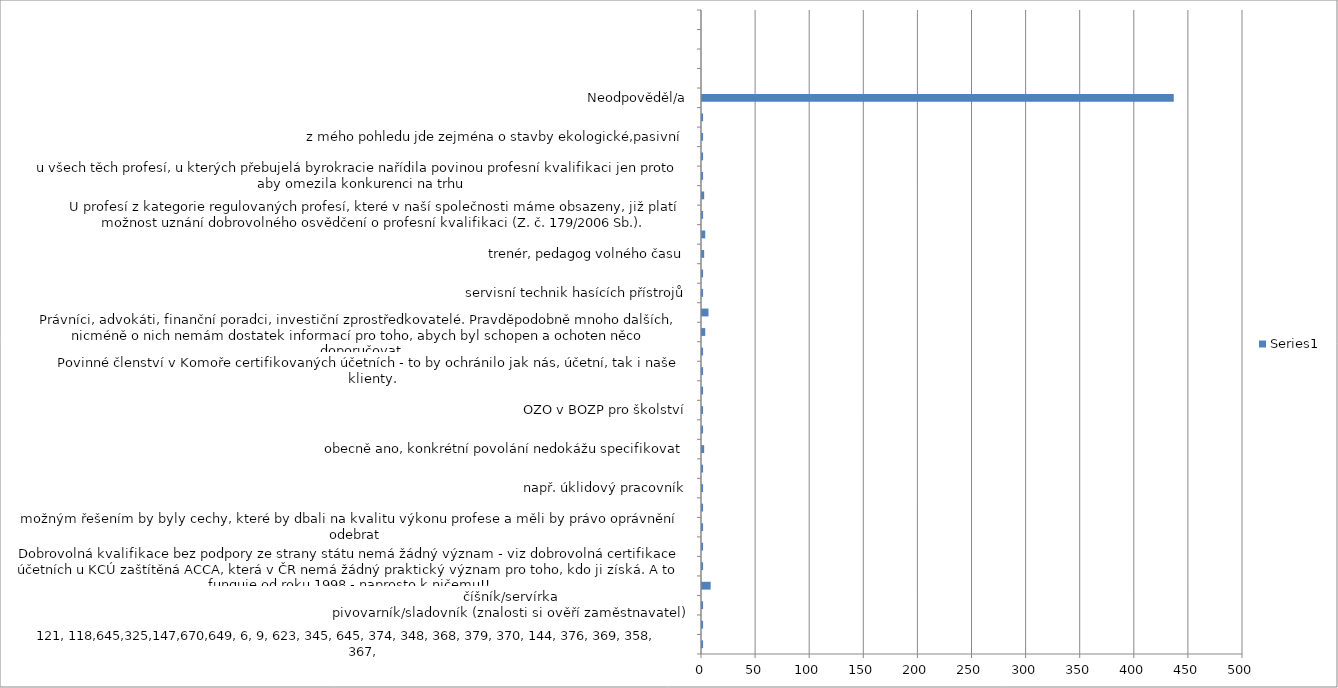
| Category | Series 0 |
|---|---|
| 121, 118,645,325,147,670,649, 6, 9, 623, 345, 645, 374, 348, 368, 379, 370, 144, 376, 369, 358, 367,
 | 1 |
| Ano, pouze u některých, za předpokladu vykonání odborných zkoušek, ne pouze formálních zkoušek. | 1 |
| číšník/servírka
pivovarník/sladovník (znalosti si ověří zaměstnavatel) | 1 |
| účetnictví a daňové poradenství | 8 |
| Dobrovolná kvalifikace bez podpory ze strany státu nemá žádný význam - viz dobrovolná certifikace účetních u KCÚ zaštítěná ACCA, která v ČR nemá žádný praktický význam pro toho, kdo ji získá. A to funguje od roku 1998 - naprosto k ničemu!! | 1 |
| K této odpovědi nemám potřebné informace z uvedené oblasti. Proto uvádím ne. | 1 |
| možným řešením by byly cechy, které by dbali na kvalitu výkonu profese a měli by právo oprávnění odebrat | 1 |
| Musí být kvalitní a náročná PK a hlavně úplná | 1 |
| např. úklidový pracovník | 1 |
| Ne, protože dosažení kvalifikace je jen vstup, dále musí její úroveň někdo hlídat a udržovat, což registr určitě nezastane:-) | 1 |
| obecně ano, konkrétní povolání nedokážu specifikovat | 2 |
| Odborně způsobilá osoba v prevenci rizik, Koordinátor na staveništi | 1 |
| OZO v BOZP pro školství | 1 |
| Polygrafické profese | 1 |
| Povinné členství v Komoře certifikovaných účetních - to by ochránilo jak nás, účetní, tak i naše klienty. | 1 |
| poznámka:
pokud by mělo být povinné získání kvalifikace nahrazeno dobrovolnou, k čemu by to bylo? To by pak nemuselo být vůbec. Nedávalo by to smysl. | 1 |
| Právníci, advokáti, finanční poradci, investiční zprostředkovatelé. Pravděpodobně mnoho dalších, nicméně o nich nemám dostatek informací pro toho, abych byl schopen a ochoten něco doporučovat. | 3 |
| řemeslné profese | 6 |
| servisní technik hasících přístrojů | 1 |
| stavebnictví | 1 |
| trenér, pedagog volného času | 2 |
| U neohrožujících lidské zdraví. | 3 |
| U profesí z kategorie regulovaných profesí, které v naší společnosti máme obsazeny, již platí možnost uznání dobrovolného osvědčení o profesní kvalifikaci (Z. č. 179/2006 Sb.). | 1 |
| u všech | 2 |
| u všech těch profesí, u kterých přebujelá byrokracie nařídila povinou profesní kvalifikaci jen proto aby omezila konkurenci na trhu | 1 |
| u žádné z profesí, které jsou dnes podřazeny pod systém povinné regulace, bych dobrovolné získávání nedoporučovala. Naopak u některých profesí (realitní makléř, finanční poradce) bych doporučovala zavedení povinného členství,zkoušek apod. | 1 |
| z mého pohledu jde zejména o stavby ekologické,pasivní | 1 |
| Znalec v oceňování majetku pro věci nemovité | 1 |
| Neodpověděl/a | 436 |